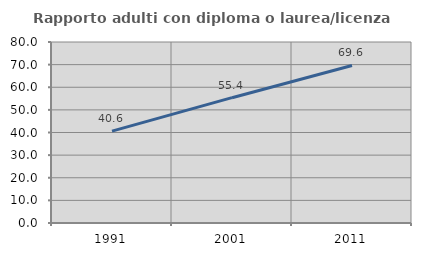
| Category | Rapporto adulti con diploma o laurea/licenza media  |
|---|---|
| 1991.0 | 40.591 |
| 2001.0 | 55.391 |
| 2011.0 | 69.629 |